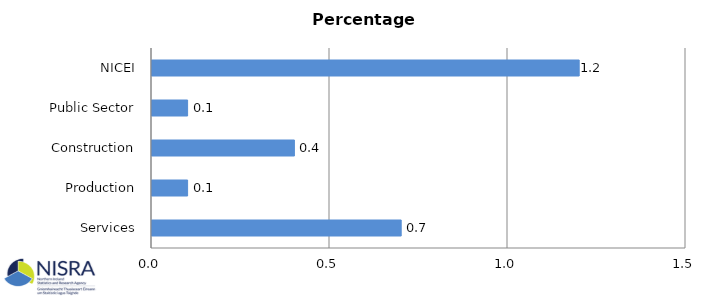
| Category | Percentage Points |
|---|---|
| Services | 0.7 |
| Production | 0.1 |
| Construction | 0.4 |
| Public Sector | 0.1 |
| NICEI | 1.2 |